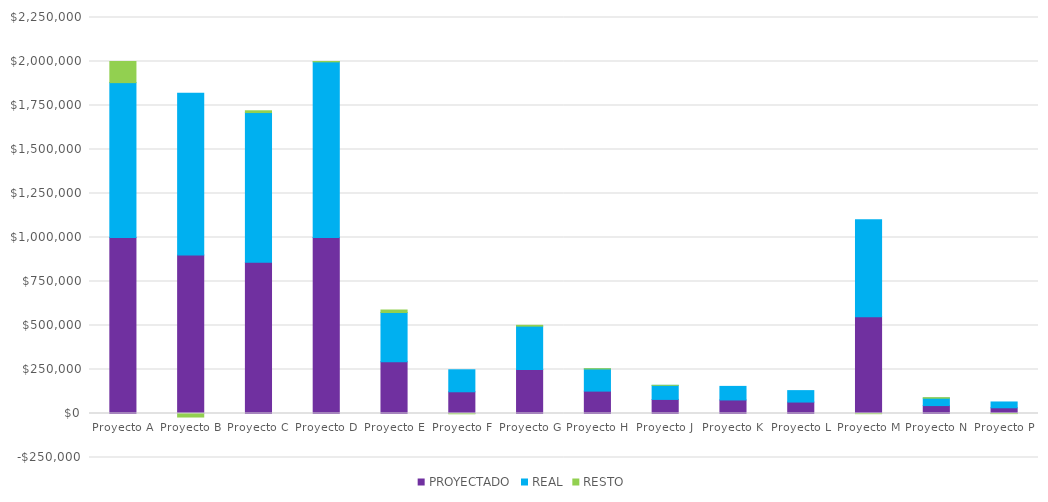
| Category | PROYECTADO | REAL | RESTO |
|---|---|---|---|
| Proyecto A | 1000000 | 880000 | 120000 |
| Proyecto B | 900000 | 920000 | -20000 |
| Proyecto C | 860000 | 850000 | 10000 |
| Proyecto D | 1000000 | 998050 | 1950 |
| Proyecto E | 294000 | 280000 | 14000 |
| Proyecto F | 123400 | 125000 | -1600 |
| Proyecto G | 250500 | 246000 | 4500 |
| Proyecto H | 127200 | 126000 | 1200 |
| Proyecto J | 80000 | 79900 | 100 |
| Proyecto K | 77000 | 77000 | 0 |
| Proyecto L | 65000 | 65000 | 0 |
| Proyecto M | 550000 | 551000 | -1000 |
| Proyecto N | 45000 | 42000 | 3000 |
| Proyecto P | 32500 | 33000 | -500 |